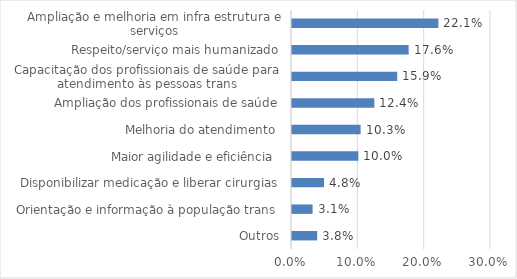
| Category | Series 0 |
|---|---|
| Outros | 0.038 |
| Orientação e informação à população trans  | 0.031 |
| Disponibilizar medicação e liberar cirurgias | 0.048 |
| Maior agilidade e eficiência  | 0.1 |
| Melhoria do atendimento  | 0.103 |
| Ampliação dos profissionais de saúde | 0.124 |
| Capacitação dos profissionais de saúde para atendimento às pessoas trans | 0.159 |
| Respeito/serviço mais humanizado | 0.176 |
| Ampliação e melhoria em infra estrutura e serviços | 0.221 |